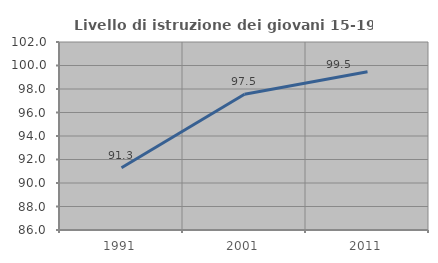
| Category | Livello di istruzione dei giovani 15-19 anni |
|---|---|
| 1991.0 | 91.299 |
| 2001.0 | 97.549 |
| 2011.0 | 99.466 |